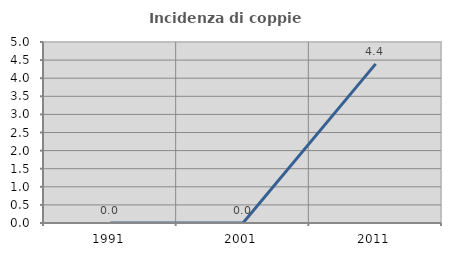
| Category | Incidenza di coppie miste |
|---|---|
| 1991.0 | 0 |
| 2001.0 | 0 |
| 2011.0 | 4.396 |